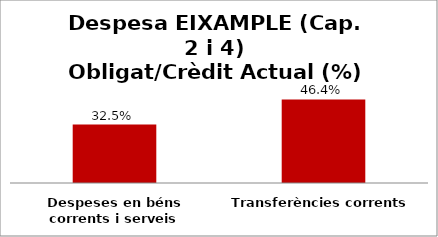
| Category | Series 0 |
|---|---|
| Despeses en béns corrents i serveis | 0.325 |
| Transferències corrents | 0.464 |